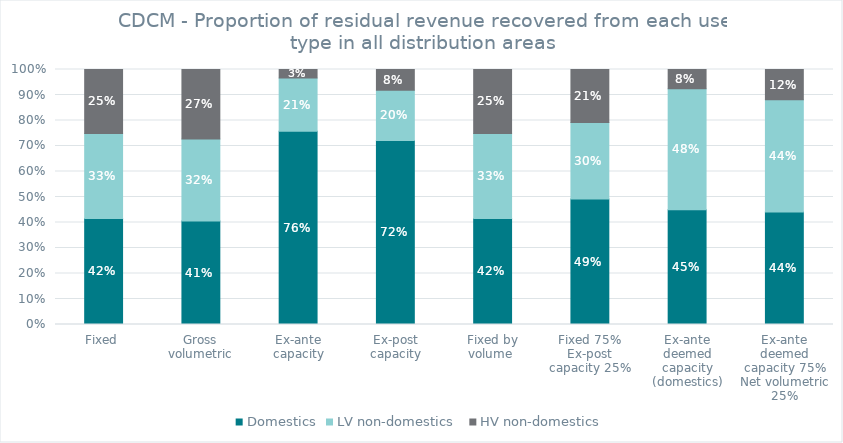
| Category | Domestics | LV non-domestics  | HV non-domestics |
|---|---|---|---|
| Fixed | 0.416 | 0.334 | 0.25 |
| Gross volumetric | 0.406 | 0.322 | 0.272 |
| Ex-ante capacity | 0.758 | 0.209 | 0.033 |
| Ex-post capacity | 0.722 | 0.197 | 0.081 |
| Fixed by volume  | 0.416 | 0.334 | 0.25 |
| Fixed 75%
Ex-post capacity 25% | 0.492 | 0.299 | 0.208 |
| Ex-ante deemed capacity (domestics) | 0.45 | 0.475 | 0.075 |
| Ex-ante deemed capacity 75%
Net volumetric 25% | 0.441 | 0.44 | 0.119 |